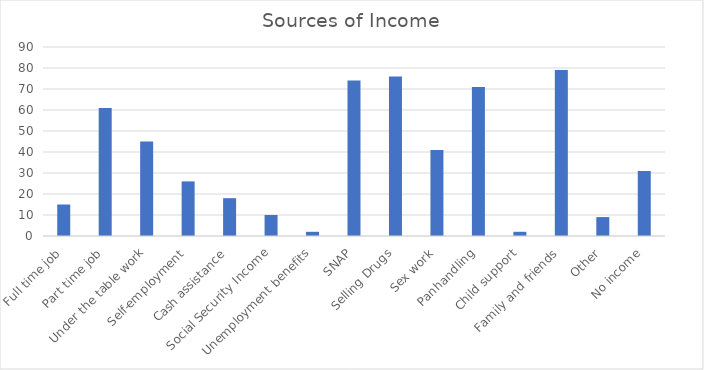
| Category | Series 0 |
|---|---|
| Full time job | 15 |
| Part time job | 61 |
| Under the table work | 45 |
| Self-employment | 26 |
| Cash assistance | 18 |
| Social Security Income | 10 |
| Unemployment benefits | 2 |
| SNAP | 74 |
| Selling Drugs | 76 |
| Sex work | 41 |
| Panhandling | 71 |
| Child support | 2 |
| Family and friends | 79 |
| Other | 9 |
| No income | 31 |